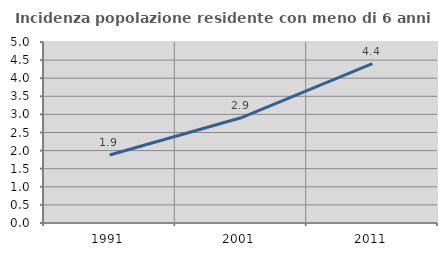
| Category | Incidenza popolazione residente con meno di 6 anni |
|---|---|
| 1991.0 | 1.88 |
| 2001.0 | 2.906 |
| 2011.0 | 4.401 |